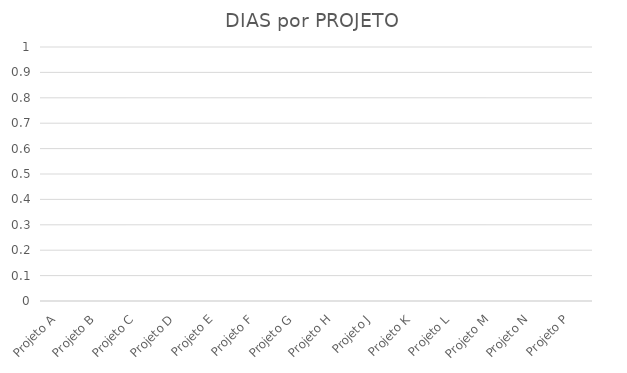
| Category | N.º de DIAS |
|---|---|
| Projeto A | 0 |
| Projeto B | 0 |
| Projeto C | 0 |
| Projeto D | 0 |
| Projeto E | 0 |
| Projeto F | 0 |
| Projeto G | 0 |
| Projeto H | 0 |
| Projeto J | 0 |
| Projeto K | 0 |
| Projeto L | 0 |
| Projeto M | 0 |
| Projeto N | 0 |
| Projeto P | 0 |